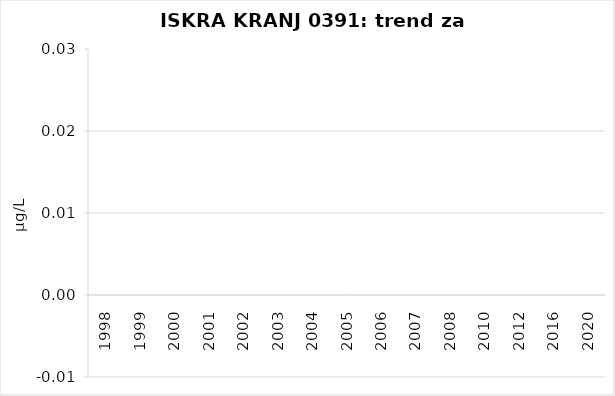
| Category | Vsota |
|---|---|
| 1998 | 0 |
| 1999 | 0 |
| 2000 | 0 |
| 2001 | 0 |
| 2002 | 0 |
| 2003 | 0 |
| 2004 | 0 |
| 2005 | 0 |
| 2006 | 0 |
| 2007 | 0 |
| 2008 | 0 |
| 2010 | 0 |
| 2012 | 0 |
| 2016 | 0 |
| 2020 | 0 |